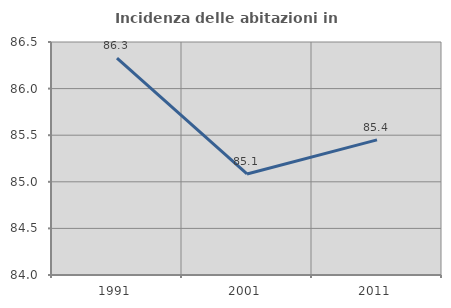
| Category | Incidenza delle abitazioni in proprietà  |
|---|---|
| 1991.0 | 86.328 |
| 2001.0 | 85.084 |
| 2011.0 | 85.449 |